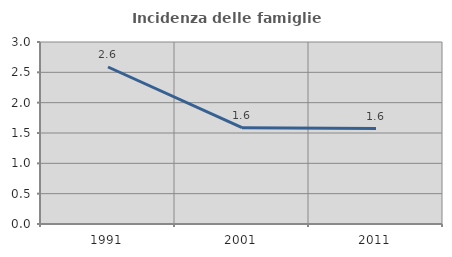
| Category | Incidenza delle famiglie numerose |
|---|---|
| 1991.0 | 2.588 |
| 2001.0 | 1.587 |
| 2011.0 | 1.573 |